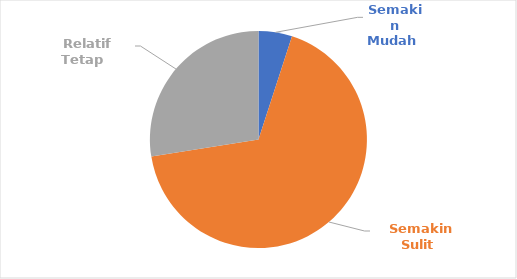
| Category | Indikator Range Collapse Sumberdaya Ikan |
|---|---|
| Semakin Mudah  | 2 |
| Semakin Sulit  | 27 |
|  Relatif Tetap  | 11 |